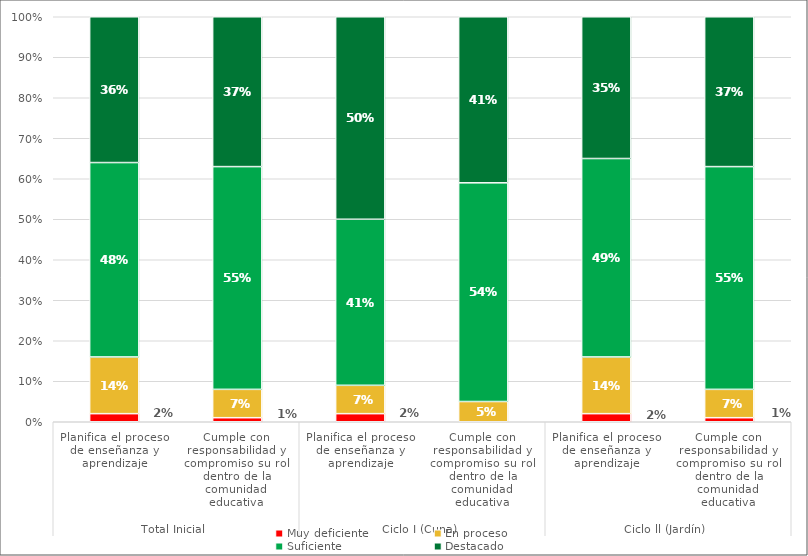
| Category | Muy deficiente | En proceso | Suficiente | Destacado |
|---|---|---|---|---|
| 0 | 0.02 | 0.14 | 0.48 | 0.36 |
| 1 | 0.01 | 0.07 | 0.55 | 0.37 |
| 2 | 0.02 | 0.07 | 0.41 | 0.5 |
| 3 | 0 | 0.05 | 0.54 | 0.41 |
| 4 | 0.02 | 0.14 | 0.49 | 0.35 |
| 5 | 0.01 | 0.07 | 0.55 | 0.37 |